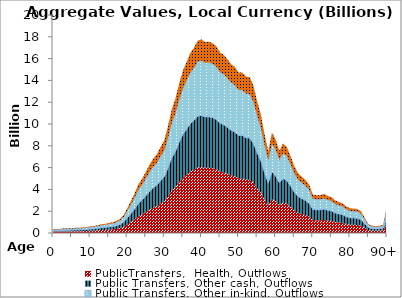
| Category | PublicTransfers,  Health, Outflows | Public Transfers, Other cash, Outflows | Public Transfers, Other in-kind, Outflows | Public Transfers, Education, Outflows |
|---|---|---|---|---|
| 0 | 127.71 | 98.219 | 106.288 | 40.643 |
|  | 126.083 | 96.967 | 104.934 | 40.125 |
| 2 | 128.24 | 98.627 | 106.73 | 40.812 |
| 3 | 142.815 | 109.836 | 118.859 | 45.45 |
| 4 | 144.5 | 111.132 | 120.262 | 45.986 |
| 5 | 151.247 | 116.32 | 125.877 | 48.133 |
| 6 | 162.757 | 125.172 | 135.456 | 51.796 |
| 7 | 167.115 | 128.524 | 139.084 | 53.184 |
| 8 | 171.336 | 131.771 | 142.597 | 54.527 |
| 9 | 187.284 | 144.036 | 155.87 | 59.602 |
| 10 | 204.266 | 157.096 | 170.003 | 65.007 |
| 11 | 219.367 | 168.71 | 182.571 | 69.812 |
| 12 | 238.857 | 183.699 | 198.792 | 76.015 |
| 13 | 276.461 | 212.62 | 230.088 | 87.982 |
| 14 | 287.627 | 221.207 | 239.381 | 91.536 |
| 15 | 314.66 | 241.997 | 261.879 | 100.139 |
| 16 | 333.444 | 256.443 | 277.512 | 106.117 |
| 17 | 372.896 | 286.786 | 310.347 | 118.672 |
| 18 | 438.833 | 337.496 | 365.224 | 139.656 |
| 19 | 562.549 | 432.643 | 468.188 | 179.028 |
| 20 | 773.491 | 598.879 | 643.747 | 246.159 |
| 21 | 1006.295 | 778.689 | 837.501 | 320.248 |
| 22 | 1246.529 | 964.194 | 1037.438 | 396.701 |
| 23 | 1524.846 | 1179.187 | 1269.071 | 485.274 |
| 24 | 1698.834 | 1313.698 | 1413.874 | 540.645 |
| 25 | 1920.939 | 1485.571 | 1598.724 | 611.328 |
| 26 | 2140.474 | 1655.669 | 1781.434 | 681.194 |
| 27 | 2328.766 | 1801.935 | 1938.143 | 741.117 |
| 28 | 2475.407 | 1916.127 | 2060.186 | 787.785 |
| 29 | 2704.462 | 2094.243 | 2250.82 | 860.681 |
| 30 | 2910.577 | 2255.113 | 2422.362 | 926.276 |
| 31 | 3362.18 | 2606.709 | 2798.213 | 1069.996 |
| 32 | 3878.53 | 3009.247 | 3227.952 | 1234.321 |
| 33 | 4214.829 | 3272.928 | 3507.84 | 1341.346 |
| 34 | 4686.553 | 3642.64 | 3900.438 | 1491.47 |
| 35 | 5083.741 | 3954.664 | 4231.002 | 1617.873 |
| 36 | 5357.854 | 4170.724 | 4459.136 | 1705.108 |
| 37 | 5637.249 | 4389.859 | 4691.666 | 1794.024 |
| 38 | 5806.843 | 4522.879 | 4832.813 | 1847.996 |
| 39 | 6023.335 | 4692.388 | 5012.991 | 1916.894 |
| 40 | 6062.254 | 4723.828 | 5045.382 | 1929.28 |
| 41 | 5979.573 | 4661.274 | 4976.569 | 1902.967 |
| 42 | 5987.006 | 4670.418 | 4982.755 | 1905.332 |
| 43 | 5941.372 | 4638.915 | 4944.776 | 1890.809 |
| 44 | 5849.079 | 4571.312 | 4867.964 | 1861.438 |
| 45 | 5646.56 | 4416.55 | 4699.415 | 1796.987 |
| 46 | 5575.013 | 4363.168 | 4639.869 | 1774.218 |
| 47 | 5434.481 | 4255.38 | 4522.91 | 1729.494 |
| 48 | 5278.528 | 4134.595 | 4393.116 | 1679.863 |
| 49 | 5193.86 | 4068.808 | 4322.65 | 1652.918 |
| 50 | 5018.276 | 3932.773 | 4176.519 | 1597.039 |
| 51 | 5017.462 | 3934.294 | 4175.841 | 1596.78 |
| 52 | 4891.972 | 3837.643 | 4071.4 | 1556.843 |
| 53 | 4874.352 | 3825.636 | 4056.736 | 1551.236 |
| 54 | 4608.645 | 3620.023 | 3835.598 | 1466.676 |
| 55 | 4120.711 | 3239.014 | 3429.51 | 1311.394 |
| 56 | 3707.484 | 2917.262 | 3085.597 | 1179.887 |
| 57 | 3087.726 | 2432.65 | 2569.795 | 982.652 |
| 58 | 2555.381 | 2016.447 | 2126.746 | 813.236 |
| 59 | 3131.556 | 2475.578 | 2606.274 | 996.601 |
| 60 | 2912.156 | 2307.347 | 2423.675 | 926.778 |
| 61 | 2563.028 | 2036.422 | 2133.109 | 815.67 |
| 62 | 2787.779 | 2222.307 | 2320.162 | 887.196 |
| 63 | 2674.856 | 2140.5 | 2226.18 | 851.258 |
| 64 | 2396.024 | 1925.819 | 1994.118 | 762.522 |
| 65 | 2083.225 | 1682.142 | 1733.788 | 662.975 |
| 66 | 1854.236 | 1503.325 | 1543.21 | 590.101 |
| 67 | 1746.598 | 1420.659 | 1453.627 | 555.845 |
| 68 | 1646.607 | 1342.704 | 1370.408 | 524.024 |
| 69 | 1502.881 | 1227.876 | 1250.79 | 478.284 |
| 70 | 1190.957 | 974.368 | 991.188 | 379.016 |
| 71 | 1166.558 | 955.61 | 970.881 | 371.251 |
| 72 | 1165.912 | 956.385 | 970.344 | 371.045 |
| 73 | 1206.166 | 990.264 | 1003.846 | 383.856 |
| 74 | 1145.041 | 940.768 | 952.973 | 364.403 |
| 75 | 1111.147 | 913.484 | 924.765 | 353.616 |
| 76 | 1009.172 | 830.048 | 839.895 | 321.164 |
| 77 | 960.543 | 790.599 | 799.423 | 305.688 |
| 78 | 919.944 | 757.685 | 765.634 | 292.767 |
| 79 | 820.945 | 676.793 | 683.241 | 261.261 |
| 80 | 765.662 | 631.734 | 637.231 | 243.668 |
| 81 | 754.33 | 622.763 | 627.8 | 240.062 |
| 82 | 737.862 | 609.48 | 614.094 | 234.821 |
| 83 | 671.2 | 554.658 | 558.614 | 213.606 |
| 84 | 467.221 | 386.248 | 388.85 | 148.691 |
| 85 | 273.451 | 226.316 | 227.583 | 87.024 |
| 86 | 222.967 | 185.2 | 185.567 | 70.958 |
| 87 | 208.1 | 173.46 | 173.193 | 66.227 |
| 88 | 224.114 | 187.417 | 186.521 | 71.323 |
| 89 | 241.184 | 202.014 | 200.728 | 76.756 |
| 90+ | 824.449 | 691.625 | 686.157 | 262.376 |